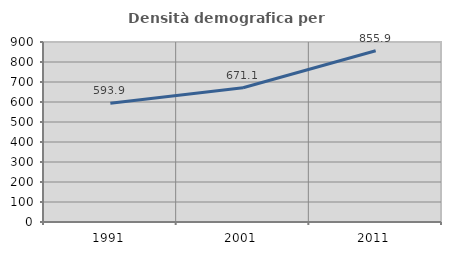
| Category | Densità demografica |
|---|---|
| 1991.0 | 593.89 |
| 2001.0 | 671.15 |
| 2011.0 | 855.914 |